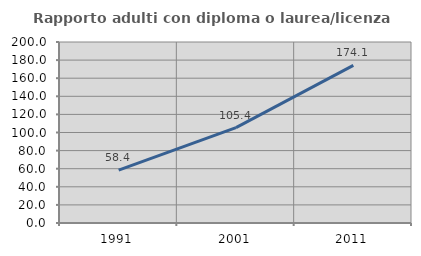
| Category | Rapporto adulti con diploma o laurea/licenza media  |
|---|---|
| 1991.0 | 58.399 |
| 2001.0 | 105.39 |
| 2011.0 | 174.123 |